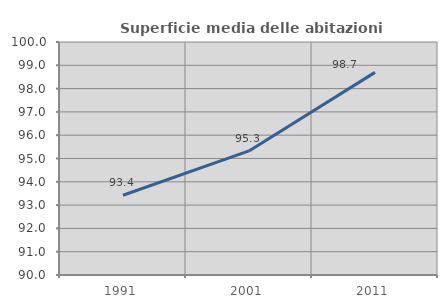
| Category | Superficie media delle abitazioni occupate |
|---|---|
| 1991.0 | 93.422 |
| 2001.0 | 95.325 |
| 2011.0 | 98.697 |